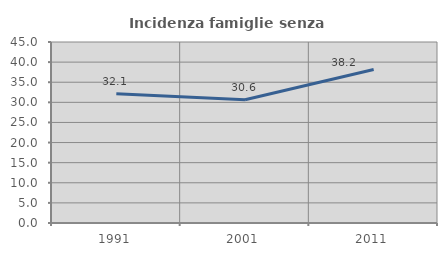
| Category | Incidenza famiglie senza nuclei |
|---|---|
| 1991.0 | 32.143 |
| 2001.0 | 30.625 |
| 2011.0 | 38.172 |